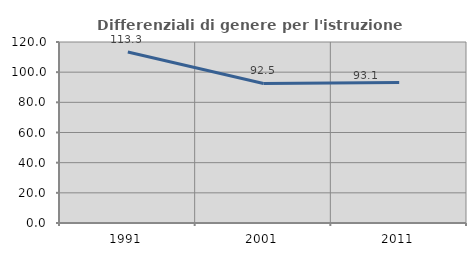
| Category | Differenziali di genere per l'istruzione superiore |
|---|---|
| 1991.0 | 113.327 |
| 2001.0 | 92.506 |
| 2011.0 | 93.132 |